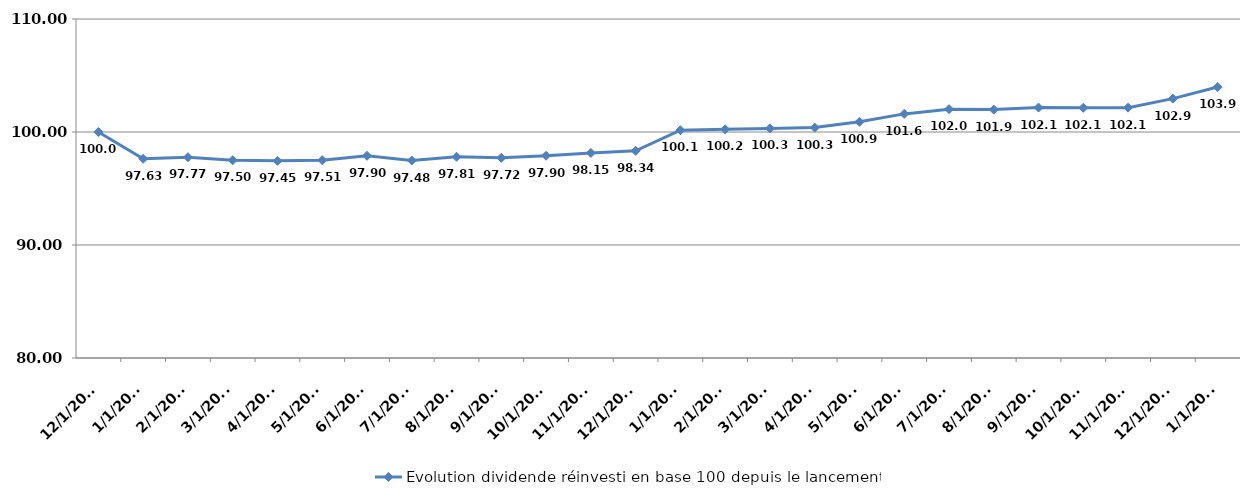
| Category |  Evolution dividende réinvesti en base 100 depuis le lancement  |
|---|---|
| 12/1/17 | 100 |
| 1/1/18 | 97.627 |
| 2/1/18 | 97.767 |
| 3/1/18 | 97.496 |
| 4/1/18 | 97.446 |
| 5/1/18 | 97.507 |
| 6/1/18 | 97.897 |
| 7/1/18 | 97.476 |
| 8/1/18 | 97.807 |
| 9/1/18 | 97.717 |
| 10/1/18 | 97.897 |
| 11/1/18 | 98.147 |
| 12/1/18 | 98.338 |
| 1/1/19 | 100.16 |
| 2/1/19 | 100.24 |
| 3/1/19 | 100.32 |
| 4/1/19 | 100.391 |
| 5/1/19 | 100.901 |
| 6/1/19 | 101.602 |
| 7/1/19 | 102.023 |
| 8/1/19 | 101.983 |
| 9/1/19 | 102.163 |
| 10/1/19 | 102.143 |
| 11/1/19 | 102.153 |
| 12/1/19 | 102.954 |
| 1/1/20 | 103.976 |